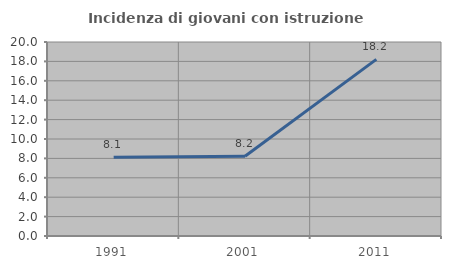
| Category | Incidenza di giovani con istruzione universitaria |
|---|---|
| 1991.0 | 8.128 |
| 2001.0 | 8.228 |
| 2011.0 | 18.204 |